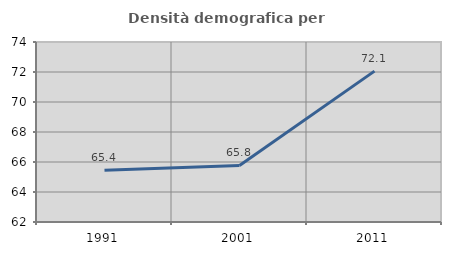
| Category | Densità demografica |
|---|---|
| 1991.0 | 65.45 |
| 2001.0 | 65.772 |
| 2011.0 | 72.059 |